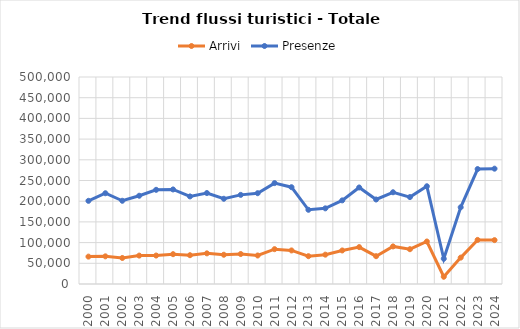
| Category | Arrivi | Presenze |
|---|---|---|
| 2000.0 | 66128 | 200903 |
| 2001.0 | 66820 | 219230 |
| 2002.0 | 62884 | 201020 |
| 2003.0 | 68634 | 213169 |
| 2004.0 | 68756 | 227488 |
| 2005.0 | 72024 | 228377 |
| 2006.0 | 69572 | 211530 |
| 2007.0 | 74032 | 219714 |
| 2008.0 | 70657 | 205870 |
| 2009.0 | 72410 | 215293 |
| 2010.0 | 68848 | 219325 |
| 2011.0 | 84152 | 243707 |
| 2012.0 | 81077 | 233815 |
| 2013.0 | 67176 | 179268 |
| 2014.0 | 70874 | 182743 |
| 2015.0 | 81018 | 202009 |
| 2016.0 | 89125 | 233146 |
| 2017.0 | 67186 | 204139 |
| 2018.0 | 90774 | 221594 |
| 2019.0 | 84043 | 209938 |
| 2020.0 | 102641 | 236071 |
| 2021.0 | 17521 | 61053 |
| 2022.0 | 63719 | 185328 |
| 2023.0 | 106490 | 277634 |
| 2024.0 | 105991 | 278582 |